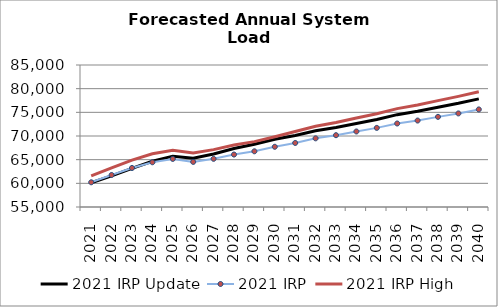
| Category | 2021 IRP Update | 2021 IRP | 2021 IRP High |
|---|---|---|---|
| 2021.0 | 60131.512 | 60221.57 | 61564.49 |
| 2022.0 | 61564.329 | 61760.91 | 63276.73 |
| 2023.0 | 63153.008 | 63242.99 | 64919.87 |
| 2024.0 | 64661.776 | 64451.31 | 66249.67 |
| 2025.0 | 65743.108 | 65162.26 | 66999.89 |
| 2026.0 | 65308.289 | 64527.03 | 66411.01 |
| 2027.0 | 66210.48 | 65178.4 | 67121.95 |
| 2028.0 | 67345.991 | 66083.42 | 68082.91 |
| 2029.0 | 68250.252 | 66768.66 | 68815.19 |
| 2030.0 | 69298.256 | 67723.21 | 69838.17 |
| 2031.0 | 70122.893 | 68528.65 | 70939.49 |
| 2032.0 | 71088.901 | 69507.21 | 72061.76 |
| 2033.0 | 71784.679 | 70170.85 | 72869.21 |
| 2034.0 | 72638.004 | 70955.08 | 73801.55 |
| 2035.0 | 73484.264 | 71713.38 | 74711.76 |
| 2036.0 | 74507.41 | 72641.24 | 75780 |
| 2037.0 | 75225.321 | 73263.63 | 76534.99 |
| 2038.0 | 76093.473 | 74042.54 | 77466.69 |
| 2039.0 | 76912.44 | 74771.42 | 78365.5 |
| 2040.0 | 77850.137 | 75613.33 | 79361.75 |